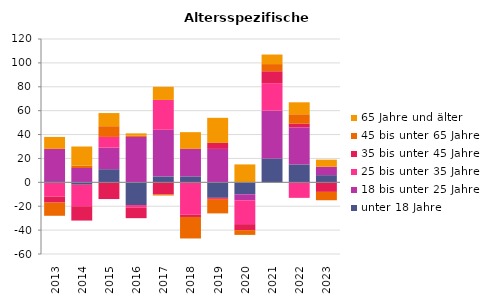
| Category | unter 18 Jahre | 18 bis unter 25 Jahre | 25 bis unter 35 Jahre | 35 bis unter 45 Jahre | 45 bis unter 65 Jahre | 65 Jahre und älter |
|---|---|---|---|---|---|---|
| 2013.0 | 1 | 27 | -12 | -5 | -11 | 10 |
| 2014.0 | -2 | 12 | -18 | -12 | 2 | 16 |
| 2015.0 | 11 | 18 | 9 | -14 | 9 | 11 |
| 2016.0 | -19 | 38 | -2 | -9 | 1 | 2 |
| 2017.0 | 5 | 39 | 25 | -10 | -1 | 11 |
| 2018.0 | 5 | 23 | -27 | -2 | -18 | 14 |
| 2019.0 | -13 | 28 | -1 | 5 | -12 | 21 |
| 2020.0 | -10 | -5 | -20 | -5 | -4 | 15 |
| 2021.0 | 20 | 40 | 23 | 10 | 6 | 8 |
| 2022.0 | 15 | 31 | -13 | 3 | 8 | 10 |
| 2023.0 | 6 | 7 | 0 | -8 | -7 | 6 |